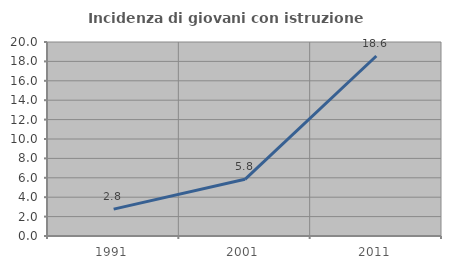
| Category | Incidenza di giovani con istruzione universitaria |
|---|---|
| 1991.0 | 2.768 |
| 2001.0 | 5.844 |
| 2011.0 | 18.557 |